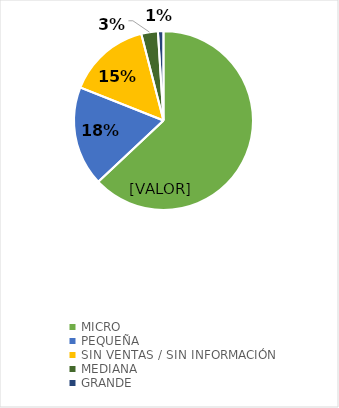
| Category | Series 0 |
|---|---|
| MICRO | 0.63 |
| PEQUEÑA | 0.18 |
| SIN VENTAS / SIN INFORMACIÓN | 0.15 |
| MEDIANA | 0.03 |
| GRANDE | 0.01 |